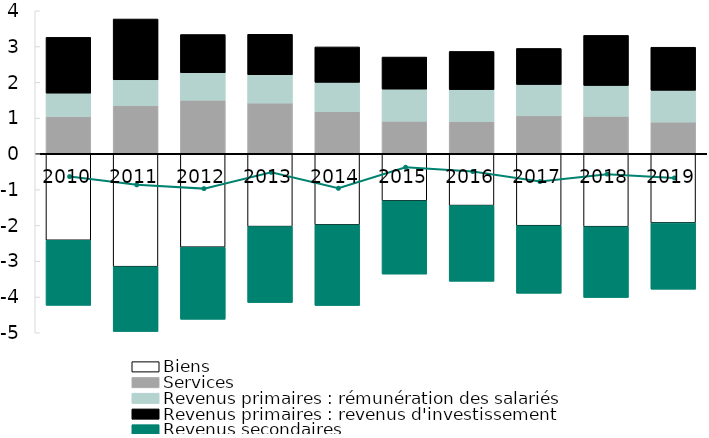
| Category | Biens | Services | Revenus primaires : rémunération des salariés | Revenus primaires : revenus d'investissement | Revenus secondaires |
|---|---|---|---|---|---|
| 2010.0 | -2.415 | 1.039 | 0.659 | 1.56 | -1.82 |
| 2011.0 | -3.153 | 1.349 | 0.721 | 1.699 | -1.81 |
| 2012.0 | -2.608 | 1.499 | 0.771 | 1.066 | -2.016 |
| 2013.0 | -2.033 | 1.422 | 0.792 | 1.129 | -2.123 |
| 2014.0 | -1.985 | 1.184 | 0.814 | 0.991 | -2.251 |
| 2015.0 | -1.313 | 0.914 | 0.896 | 0.896 | -2.047 |
| 2016.0 | -1.445 | 0.905 | 0.89 | 1.069 | -2.117 |
| 2017.0 | -2.008 | 1.064 | 0.877 | 1.007 | -1.888 |
| 2018.0 | -2.036 | 1.05 | 0.864 | 1.398 | -1.978 |
| 2019.0 | -1.93 | 0.89 | 0.887 | 1.204 | -1.852 |